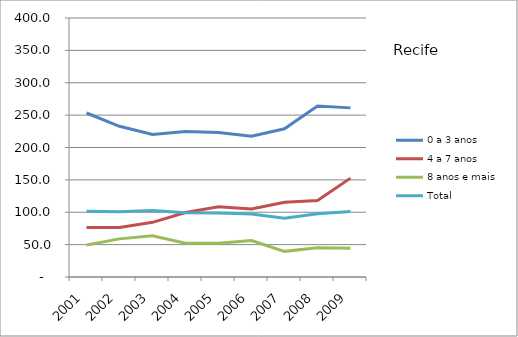
| Category | 0 a 3 anos | 4 a 7 anos | 8 anos e mais | Total |
|---|---|---|---|---|
| 2001.0 | 253.3 | 76.4 | 49.3 | 101.7 |
| 2002.0 | 232.7 | 76.4 | 58.9 | 100.9 |
| 2003.0 | 220 | 84.4 | 63.8 | 102.6 |
| 2004.0 | 224.8 | 99.7 | 52.2 | 99.3 |
| 2005.0 | 223.2 | 108.4 | 52.3 | 98.9 |
| 2006.0 | 217.5 | 105.2 | 56.3 | 97.2 |
| 2007.0 | 228.9 | 115.5 | 39.6 | 90.8 |
| 2008.0 | 264.1 | 118.1 | 45 | 97.7 |
| 2009.0 | 261.2 | 152.7 | 44.3 | 101 |